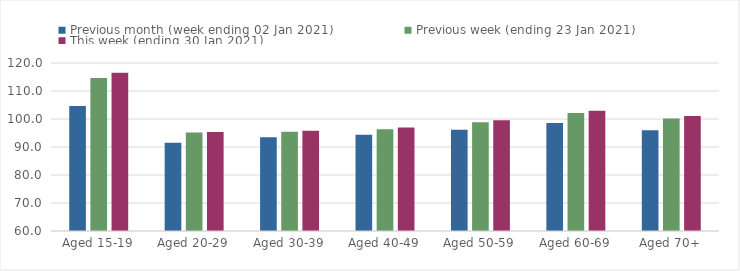
| Category | Previous month (week ending 02 Jan 2021) | Previous week (ending 23 Jan 2021) | This week (ending 30 Jan 2021) |
|---|---|---|---|
| Aged 15-19 | 104.6 | 114.64 | 116.55 |
| Aged 20-29 | 91.51 | 95.2 | 95.39 |
| Aged 30-39 | 93.44 | 95.44 | 95.79 |
| Aged 40-49 | 94.38 | 96.37 | 96.92 |
| Aged 50-59 | 96.13 | 98.81 | 99.51 |
| Aged 60-69 | 98.53 | 102.12 | 102.91 |
| Aged 70+ | 96.02 | 100.16 | 101.1 |